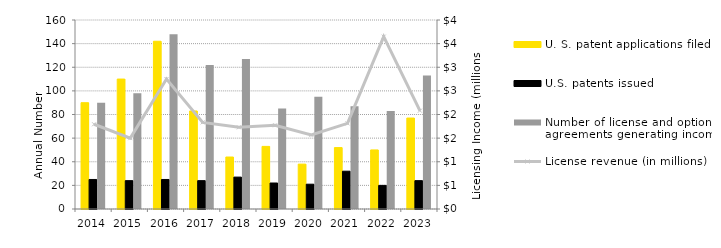
| Category | U. S. patent applications filed | U.S. patents issued | Number of license and option agreements generating income  |
|---|---|---|---|
| 2014.0 | 90 | 25 | 90 |
| 2015.0 | 110 | 24 | 98 |
| 2016.0 | 142 | 25 | 148 |
| 2017.0 | 83 | 24 | 122 |
| 2018.0 | 44 | 27 | 127 |
| 2019.0 | 53 | 22 | 85 |
| 2020.0 | 38 | 21 | 95 |
| 2021.0 | 52 | 32 | 87 |
| 2022.0 | 50 | 20 | 83 |
| 2023.0 | 77 | 24 | 113 |